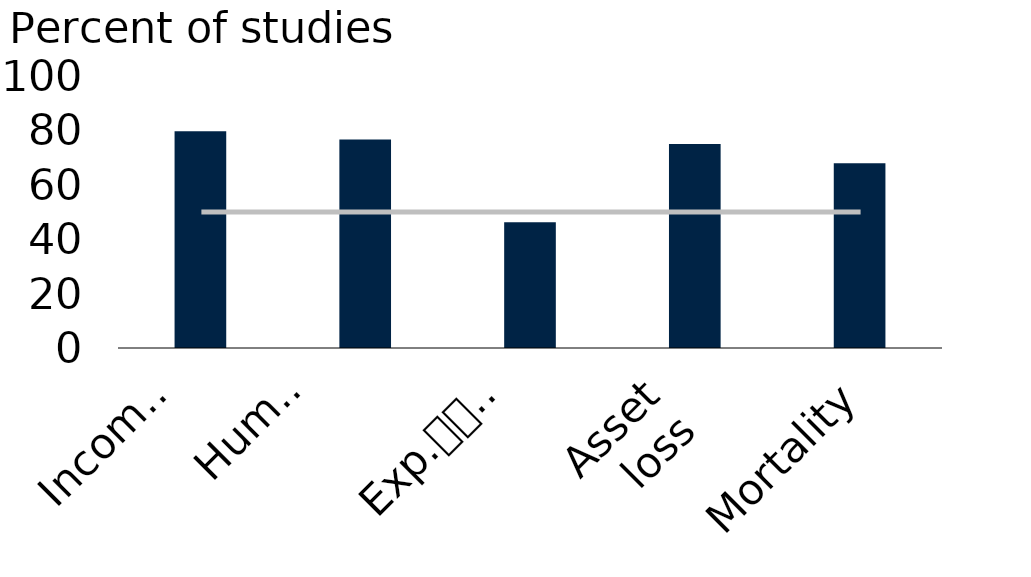
| Category | Series 0 |
|---|---|
| Income
loss | 79.7 |
| Human
capital
loss | 76.7 |
| Exp.
reduction | 46.2 |
| Asset
loss | 75 |
| Mortality | 67.9 |